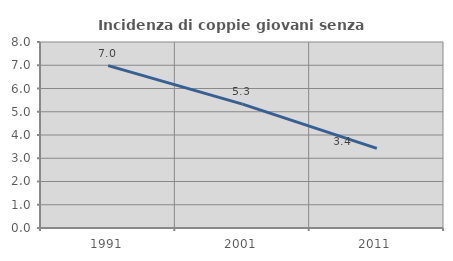
| Category | Incidenza di coppie giovani senza figli |
|---|---|
| 1991.0 | 6.983 |
| 2001.0 | 5.328 |
| 2011.0 | 3.423 |